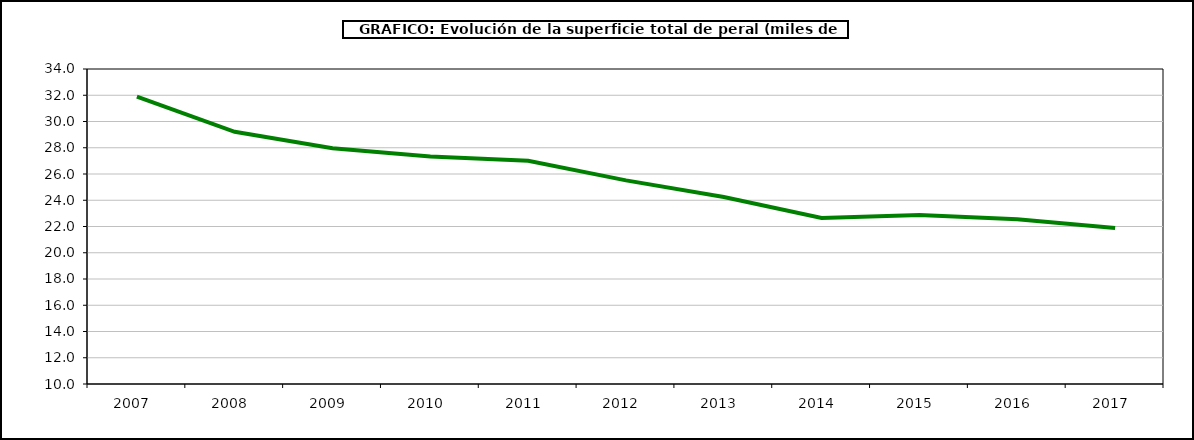
| Category | superficie peral |
|---|---|
| 2007.0 | 31.891 |
| 2008.0 | 29.216 |
| 2009.0 | 27.967 |
| 2010.0 | 27.331 |
| 2011.0 | 27.01 |
| 2012.0 | 25.512 |
| 2013.0 | 24.243 |
| 2014.0 | 22.643 |
| 2015.0 | 22.878 |
| 2016.0 | 22.547 |
| 2017.0 | 21.888 |